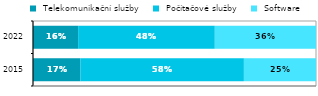
| Category |  Telekomunikační služby |  Počítačové služby |  Software |
|---|---|---|---|
|  2015 | 0.167 | 0.578 | 0.255 |
| 2022 | 0.159 | 0.483 | 0.358 |